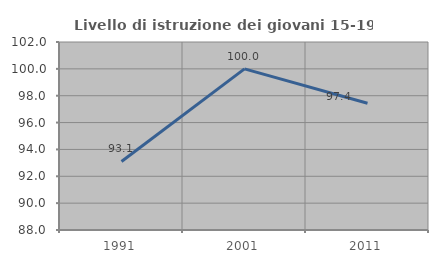
| Category | Livello di istruzione dei giovani 15-19 anni |
|---|---|
| 1991.0 | 93.103 |
| 2001.0 | 100 |
| 2011.0 | 97.436 |